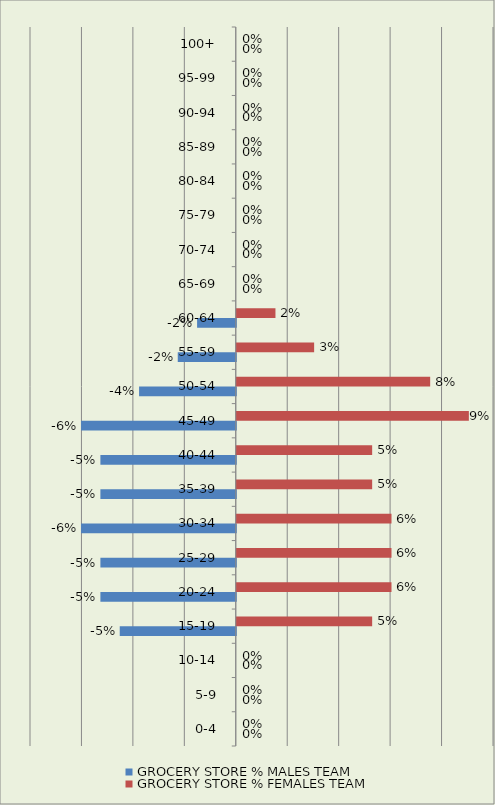
| Category |  GROCERY STORE  % MALES TEAM |  GROCERY STORE  % FEMALES TEAM |
|---|---|---|
|  0-4  | 0 | 0 |
|  5-9  | 0 | 0 |
|  10-14  | 0 | 0 |
|  15-19  | -0.045 | 0.053 |
|  20-24  | -0.053 | 0.06 |
|  25-29  | -0.053 | 0.06 |
|  30-34  | -0.06 | 0.06 |
|  35-39  | -0.053 | 0.053 |
|  40-44  | -0.053 | 0.053 |
|  45-49  | -0.06 | 0.09 |
|  50-54  | -0.038 | 0.075 |
|  55-59  | -0.023 | 0.03 |
|  60-64  | -0.015 | 0.015 |
|  65-69  | 0 | 0 |
|  70-74  | 0 | 0 |
|  75-79  | 0 | 0 |
|  80-84  | 0 | 0 |
|  85-89  | 0 | 0 |
|  90-94  | 0 | 0 |
|  95-99  | 0 | 0 |
|  100+  | 0 | 0 |